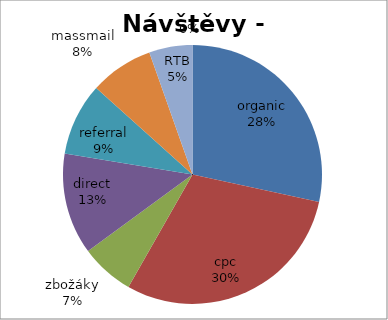
| Category | Series 0 |
|---|---|
| organic | 67254.796 |
| cpc | 70700.271 |
| zbožáky | 15851.897 |
| direct | 29977.822 |
| referral | 21490.638 |
| massmail | 18793.846 |
| RTB | 12804.919 |